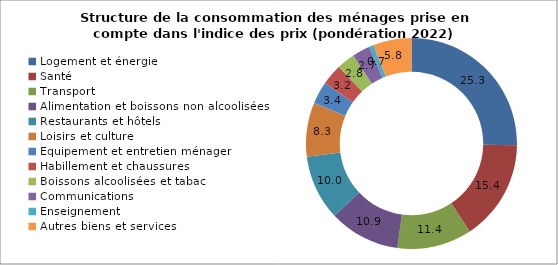
| Category | Structure de la consommation des ménages prise en compte dans l'indice des prix |
|---|---|
| Logement et énergie | 25.254 |
| Santé | 15.439 |
| Transport | 11.447 |
| Alimentation et boissons non alcoolisées | 10.87 |
| Restaurants et hôtels | 10.004 |
| Loisirs et culture | 8.277 |
| Equipement et entretien ménager | 3.444 |
| Habillement et chaussures | 3.179 |
| Boissons alcoolisées et tabac | 2.785 |
| Communications | 2.719 |
| Enseignement | 0.737 |
| Autres biens et services | 5.845 |